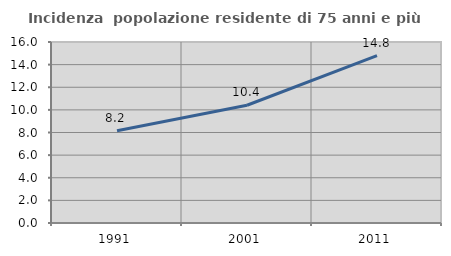
| Category | Incidenza  popolazione residente di 75 anni e più |
|---|---|
| 1991.0 | 8.155 |
| 2001.0 | 10.411 |
| 2011.0 | 14.795 |